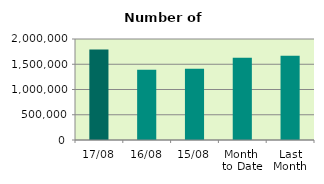
| Category | Series 0 |
|---|---|
| 17/08 | 1790680 |
| 16/08 | 1392576 |
| 15/08 | 1408616 |
| Month 
to Date | 1630612.615 |
| Last
Month | 1667155.619 |